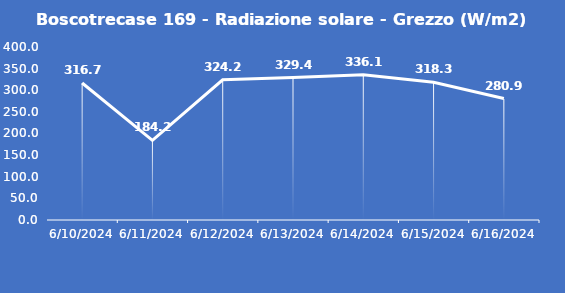
| Category | Boscotrecase 169 - Radiazione solare - Grezzo (W/m2) |
|---|---|
| 6/10/24 | 316.7 |
| 6/11/24 | 184.2 |
| 6/12/24 | 324.2 |
| 6/13/24 | 329.4 |
| 6/14/24 | 336.1 |
| 6/15/24 | 318.3 |
| 6/16/24 | 280.9 |